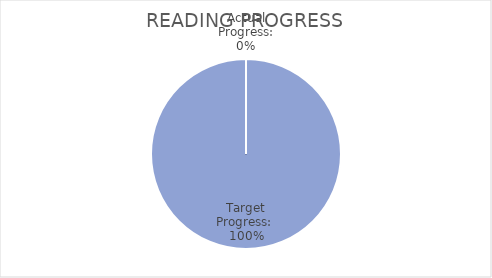
| Category | Series 0 |
|---|---|
| Actual Progress: | 0 |
| Target Progress:  | -0.007 |